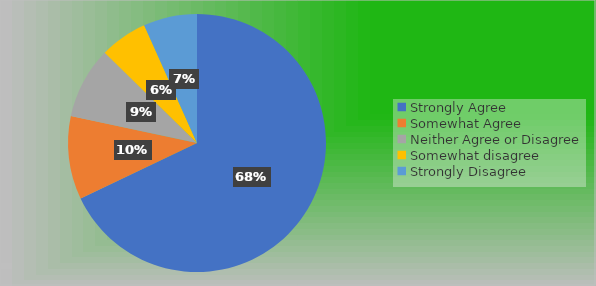
| Category | Series 0 |
|---|---|
| Strongly Agree | 91 |
| Somewhat Agree | 14 |
| Neither Agree or Disagree | 12 |
| Somewhat disagree | 8 |
| Strongly Disagree | 9 |